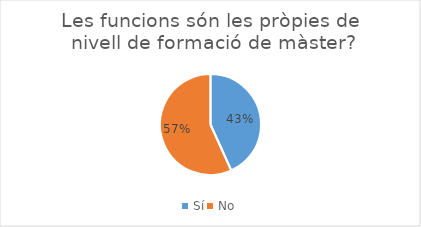
| Category | Series 0 |
|---|---|
| Sí | 48 |
| No | 63 |